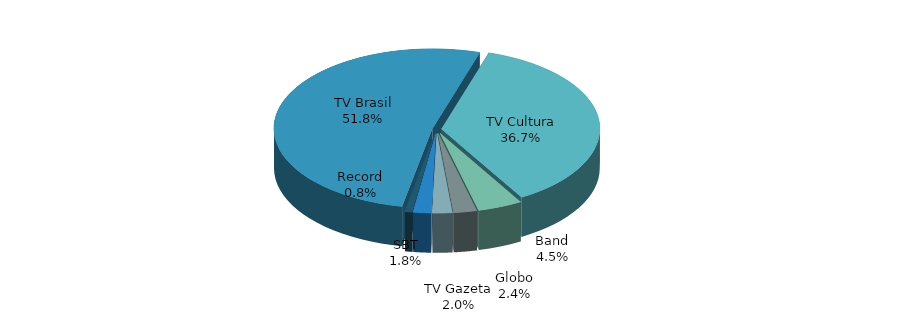
| Category | Series 0 |
|---|---|
| TV Brasil | 0.518 |
| TV Cultura | 0.367 |
| Band | 0.045 |
| Globo | 0.024 |
| TV Gazeta | 0.02 |
| SBT | 0.018 |
| Record | 0.008 |